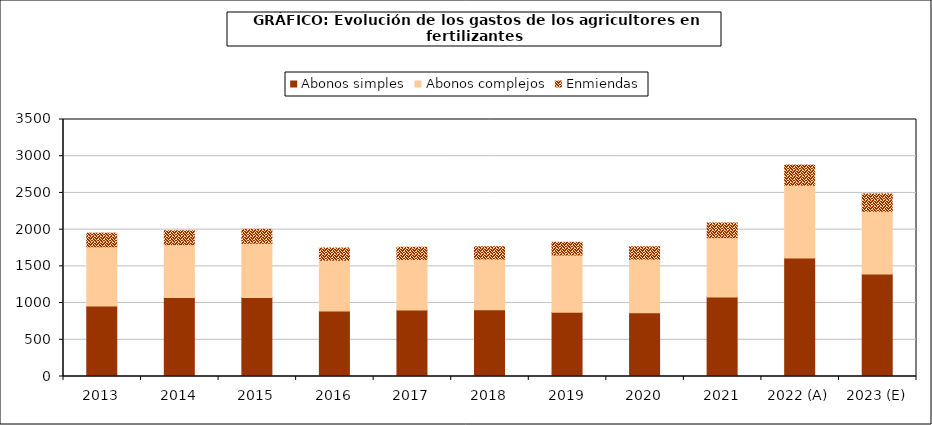
| Category | Abonos simples | Abonos complejos | Enmiendas |
|---|---|---|---|
| 2013 | 959.679 | 806.665 | 185.766 |
| 2014 | 1074.953 | 720.53 | 188.831 |
| 2015 | 1074.955 | 739.068 | 190.781 |
| 2016 | 891.426 | 691.817 | 166.51 |
| 2017 | 906.183 | 686.53 | 167.506 |
| 2018 | 908.668 | 690.56 | 168.191 |
| 2019 | 876.483 | 777.519 | 173.951 |
| 2020 | 866.521 | 731.704 | 168.085 |
| 2021 | 1083.601 | 807.82 | 198.921 |
| 2022 (A) | 1614.977 | 990.463 | 274.014 |
| 2023 (E) | 1394.712 | 855.375 | 236.642 |